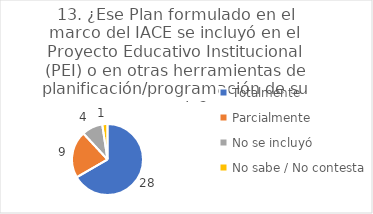
| Category | 13. ¿Ese Plan formulado en el marco del IACE se incluyó en el Proyecto Educativo Institucional (PEI) o en otras herramientas de planificación/programación de su escuela? |
|---|---|
| Totalmente  | 0.667 |
| Parcialmente  | 0.214 |
| No se incluyó  | 0.095 |
| No sabe / No contesta | 0.024 |